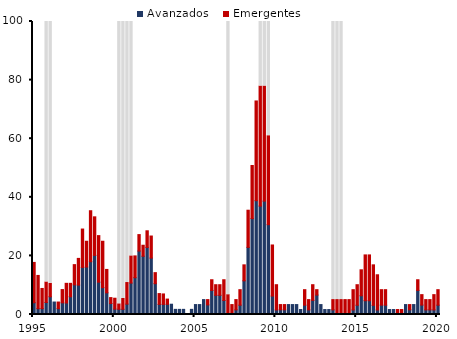
| Category | Avanzados | Emergentes | Eventos |
|---|---|---|---|
| 1995 | 4.014 | 13.763 | 0 |
|  | 1.986 | 11.348 | 0 |
|  | 2.007 | 6.882 | 0 |
|  | 4.094 | 7.018 | 88.889 |
| 1996 | 6.053 | 4.585 | 89.362 |
|  | 4.255 | 0 | 0 |
|  | 1.992 | 2.263 | 0 |
|  | 3.984 | 4.527 | 0 |
| 1997 | 3.933 | 6.705 | 0 |
|  | 6.053 | 4.585 | 0 |
|  | 10.121 | 6.901 | 0 |
|  | 10.03 | 9.119 | 0 |
| 1998 | 16.068 | 13.099 | 0 |
|  | 16.197 | 8.803 | 0 |
|  | 18.013 | 17.404 | 0 |
|  | 20.175 | 13.158 | 0 |
| 1999 | 11.034 | 15.889 | 0 |
|  | 9.164 | 15.836 | 0 |
|  | 7.396 | 7.988 | 0 |
|  | 3.746 | 2.023 | 0 |
| 2000 | 1.852 | 3.704 | 0 |
|  | 1.785 | 1.851 | 96.364 |
|  | 1.774 | 3.68 | 94.545 |
|  | 3.549 | 7.36 | 89.091 |
| 2001 | 10.728 | 9.272 | 80 |
|  | 12.558 | 7.442 | 0 |
|  | 21.658 | 5.615 | 0 |
|  | 19.887 | 3.75 | 0 |
| 2002 | 22.896 | 5.675 | 0 |
|  | 19.262 | 7.523 | 0 |
|  | 10.519 | 3.766 | 0 |
|  | 3.444 | 3.699 | 0 |
| 2003 | 3.447 | 3.57 | 0 |
|  | 3.467 | 1.796 | 0 |
|  | 3.509 | 0 | 0 |
|  | 1.754 | 0 | 0 |
| 2004 | 1.754 | 0 | 0 |
|  | 1.754 | 0 | 0 |
|  | 0 | 0 | 0 |
|  | 1.754 | 0 | 0 |
| 2005 | 3.39 | 0 | 0 |
|  | 3.39 | 0 | 0 |
|  | 5.085 | 0 | 0 |
|  | 3.273 | 1.812 | 0 |
| 2006 | 8.223 | 3.642 | 0 |
|  | 6.546 | 3.624 | 0 |
|  | 6.546 | 3.624 | 0 |
|  | 4.791 | 7.073 | 0 |
| 2007 | 0 | 6.78 | 93.22 |
|  | 0 | 3.39 | 0 |
|  | 1.582 | 3.503 | 0 |
|  | 3.185 | 5.29 | 0 |
| 2008 | 11.495 | 5.454 | 0 |
|  | 22.911 | 12.683 | 0 |
|  | 32.729 | 18.118 | 0 |
|  | 38.839 | 34.042 | 0 |
| 2009 | 37.001 | 40.965 | 22.034 |
|  | 38.695 | 39.271 | 22.034 |
|  | 30.653 | 30.364 | 38.983 |
|  | 6.298 | 17.431 | 0 |
| 2010 | 1.556 | 8.614 | 0 |
|  | 1.609 | 1.781 | 0 |
|  | 1.609 | 1.781 | 0 |
|  | 3.39 | 0 | 0 |
| 2011 | 3.39 | 0 | 0 |
|  | 3.39 | 0 | 0 |
|  | 1.695 | 0 | 0 |
|  | 3.185 | 5.29 | 0 |
| 2012 | 1.582 | 3.503 | 0 |
|  | 4.826 | 5.343 | 0 |
|  | 6.637 | 1.837 | 0 |
|  | 3.39 | 0 | 0 |
| 2013 | 1.695 | 0 | 0 |
|  | 1.695 | 0 | 0 |
|  | 1.582 | 3.503 | 94.915 |
|  | 0 | 5.085 | 94.915 |
| 2014 | 0 | 5.085 | 94.915 |
|  | 0 | 5.085 | 0 |
|  | 0 | 5.085 | 0 |
|  | 1.561 | 6.913 | 0 |
| 2015 | 3.164 | 7.006 | 0 |
|  | 6.399 | 8.855 | 0 |
|  | 4.707 | 15.632 | 0 |
|  | 4.707 | 15.632 | 0 |
| 2016 | 3.122 | 13.827 | 0 |
|  | 1.55 | 12.01 | 0 |
|  | 3.185 | 5.29 | 0 |
|  | 3.185 | 5.29 | 0 |
| 2017 | 1.695 | 0 | 0 |
|  | 1.695 | 0 | 0 |
|  | 0 | 1.695 | 0 |
|  | 0 | 1.695 | 0 |
| 2018 | 3.39 | 0 | 0 |
|  | 1.609 | 1.781 | 0 |
|  | 3.39 | 0 | 0 |
|  | 8.223 | 3.642 | 0 |
| 2019 | 3.217 | 3.562 | 0 |
|  | 1.582 | 3.503 | 0 |
|  | 1.582 | 3.503 | 0 |
|  | 1.569 | 5.211 | 0 |
| 2020 | 3.185 | 5.29 | 0 |